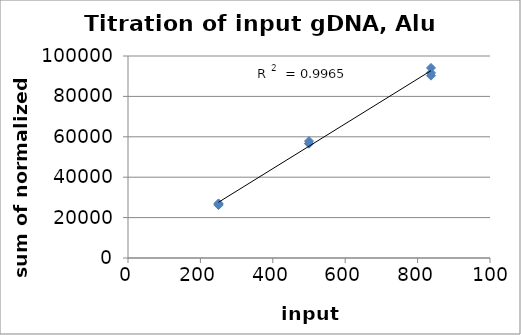
| Category | Series 0 |
|---|---|
| 250.0 | 26633.118 |
| 250.0 | 27023.621 |
| 250.0 | 26162.359 |
| 500.0 | 57890.616 |
| 500.0 | 56716.85 |
| 500.0 | 56564.853 |
| 837.0 | 90259.102 |
| 837.0 | 94105.624 |
| 837.0 | 91645.435 |